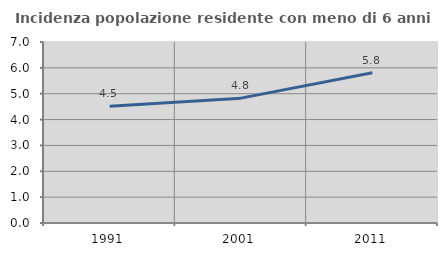
| Category | Incidenza popolazione residente con meno di 6 anni |
|---|---|
| 1991.0 | 4.516 |
| 2001.0 | 4.829 |
| 2011.0 | 5.808 |